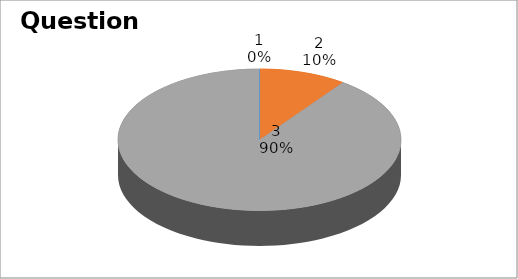
| Category | NIL |
|---|---|
| 0 | 0 |
| 1 | 6 |
| 2 | 54 |